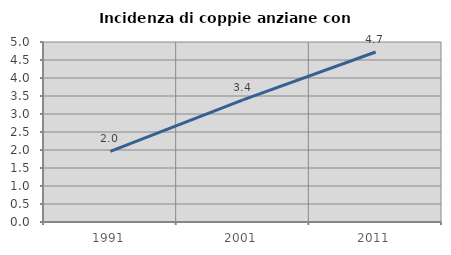
| Category | Incidenza di coppie anziane con figli |
|---|---|
| 1991.0 | 1.962 |
| 2001.0 | 3.394 |
| 2011.0 | 4.722 |